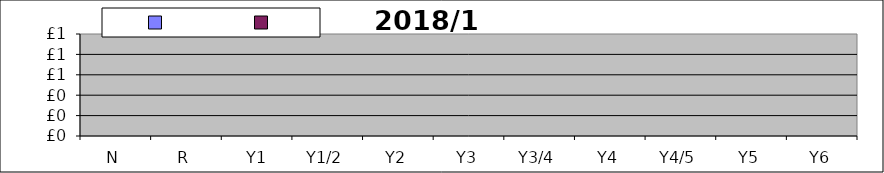
| Category | Series 0 | Series 1 |
|---|---|---|
| N | 0 |  |
| R | 0 |  |
|  Y1 | 0 |  |
| Y1/2 | 0 |  |
| Y2 | 0 |  |
| Y3 | 0 |  |
| Y3/4 | 0 |  |
| Y4 | 0 |  |
| Y4/5 | 0 |  |
| Y5 | 0 |  |
| Y6 | 0 |  |